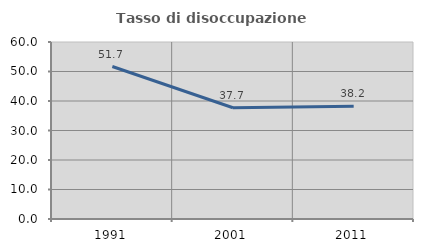
| Category | Tasso di disoccupazione giovanile  |
|---|---|
| 1991.0 | 51.684 |
| 2001.0 | 37.712 |
| 2011.0 | 38.215 |